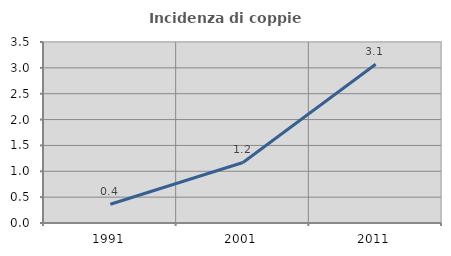
| Category | Incidenza di coppie miste |
|---|---|
| 1991.0 | 0.363 |
| 2001.0 | 1.171 |
| 2011.0 | 3.069 |